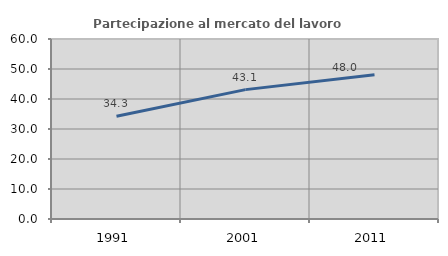
| Category | Partecipazione al mercato del lavoro  femminile |
|---|---|
| 1991.0 | 34.256 |
| 2001.0 | 43.125 |
| 2011.0 | 48.048 |